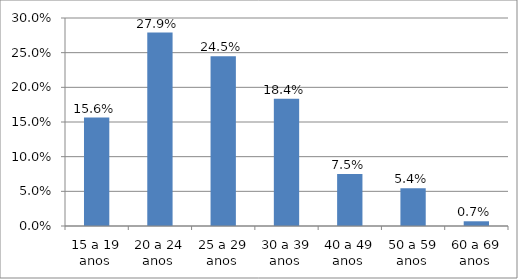
| Category | Series 0 |
|---|---|
| 15 a 19 anos  | 0.156 |
| 20 a 24 anos  | 0.279 |
| 25 a 29 anos  | 0.245 |
| 30 a 39 anos  | 0.184 |
| 40 a 49 anos  | 0.075 |
| 50 a 59 anos  | 0.054 |
| 60 a 69 anos  | 0.007 |